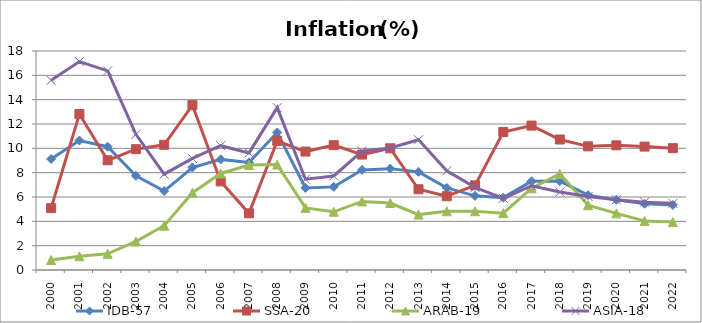
| Category | IDB-57 | SSA-20 | ARAB-19 | ASIA-18 |
|---|---|---|---|---|
| 2000.0 | 9.123 | 5.084 | 0.82 | 15.587 |
| 2001.0 | 10.642 | 12.819 | 1.13 | 17.133 |
| 2002.0 | 10.136 | 9.017 | 1.334 | 16.363 |
| 2003.0 | 7.74 | 9.931 | 2.343 | 11.149 |
| 2004.0 | 6.489 | 10.293 | 3.646 | 7.877 |
| 2005.0 | 8.425 | 13.551 | 6.354 | 9.168 |
| 2006.0 | 9.091 | 7.279 | 7.935 | 10.218 |
| 2007.0 | 8.84 | 4.661 | 8.635 | 9.624 |
| 2008.0 | 11.305 | 10.611 | 8.662 | 13.349 |
| 2009.0 | 6.747 | 9.733 | 5.103 | 7.461 |
| 2010.0 | 6.832 | 10.261 | 4.784 | 7.727 |
| 2011.0 | 8.228 | 9.487 | 5.638 | 9.772 |
| 2012.0 | 8.332 | 10.001 | 5.508 | 10.026 |
| 2013.0 | 8.064 | 6.635 | 4.553 | 10.708 |
| 2014.0 | 6.75 | 6.063 | 4.828 | 8.148 |
| 2015.0 | 6.097 | 6.958 | 4.828 | 6.788 |
| 2016.0 | 5.945 | 11.347 | 4.673 | 5.893 |
| 2017.0 | 7.293 | 11.869 | 6.721 | 6.929 |
| 2018.0 | 7.306 | 10.727 | 7.894 | 6.409 |
| 2019.0 | 6.155 | 10.162 | 5.331 | 6.04 |
| 2020.0 | 5.778 | 10.249 | 4.654 | 5.774 |
| 2021.0 | 5.442 | 10.144 | 4.024 | 5.577 |
| 2022.0 | 5.351 | 10.016 | 3.942 | 5.481 |